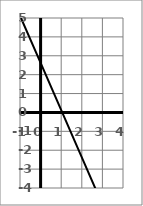
| Category | Series 8 |
|---|---|
| -1.0 | 5 |
| 0.0 | 2.5 |
| 1.0 | 0 |
| 2.0 | -2.5 |
| 3.0 | -5 |
| 4.0 | -7.5 |